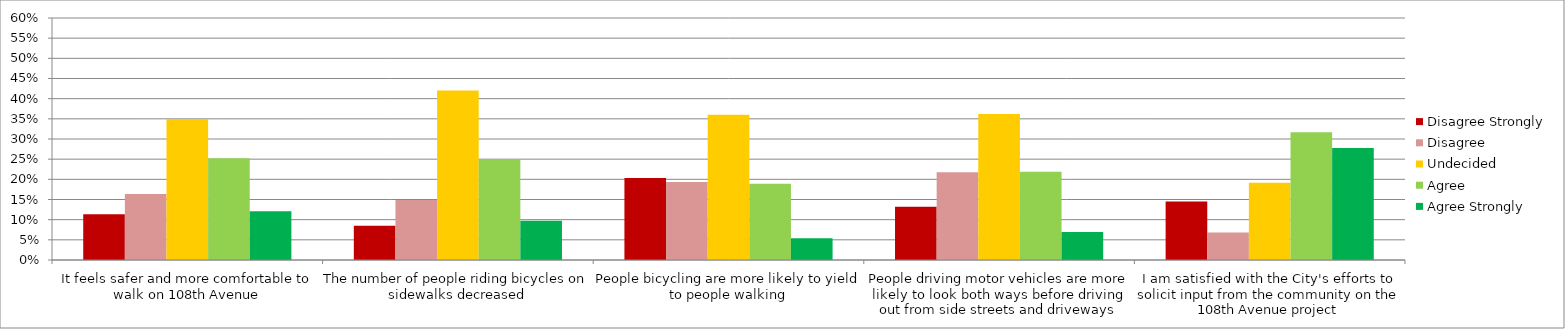
| Category | Disagree Strongly | Disagree | Undecided | Agree | Agree Strongly |
|---|---|---|---|---|---|
| It feels safer and more comfortable to walk on 108th Avenue | 0.114 | 0.164 | 0.35 | 0.252 | 0.121 |
| The number of people riding bicycles on sidewalks decreased | 0.085 | 0.149 | 0.42 | 0.249 | 0.097 |
| People bicycling are more likely to yield to people walking | 0.203 | 0.193 | 0.36 | 0.189 | 0.054 |
| People driving motor vehicles are more likely to look both ways before driving out from side streets and driveways | 0.132 | 0.217 | 0.362 | 0.219 | 0.07 |
| I am satisfied with the City's efforts to solicit input from the community on the 108th Avenue project | 0.145 | 0.068 | 0.191 | 0.317 | 0.278 |